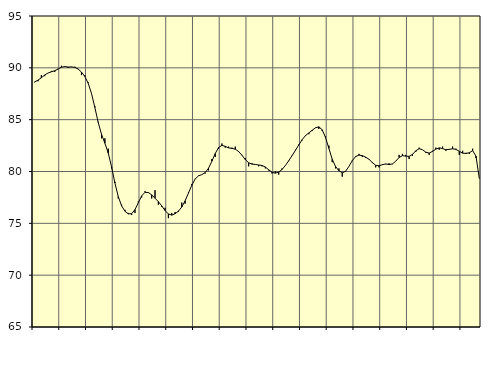
| Category | Piggar | Series 1 |
|---|---|---|
| nan | 88.6 | 88.65 |
| 87.0 | 88.7 | 88.81 |
| 87.0 | 89.3 | 89.04 |
| 87.0 | 89.2 | 89.31 |
| nan | 89.5 | 89.5 |
| 88.0 | 89.7 | 89.62 |
| 88.0 | 89.6 | 89.72 |
| 88.0 | 89.9 | 89.88 |
| nan | 90.2 | 90.06 |
| 89.0 | 90.1 | 90.12 |
| 89.0 | 90 | 90.08 |
| 89.0 | 90.1 | 90.08 |
| nan | 90.1 | 90.05 |
| 90.0 | 89.9 | 89.88 |
| 90.0 | 89.3 | 89.59 |
| 90.0 | 89.3 | 89.17 |
| nan | 88.6 | 88.52 |
| 91.0 | 87.5 | 87.53 |
| 91.0 | 86.3 | 86.18 |
| 91.0 | 84.8 | 84.74 |
| nan | 83.2 | 83.58 |
| 92.0 | 83.2 | 82.73 |
| 92.0 | 82.2 | 81.79 |
| 92.0 | 80.3 | 80.45 |
| nan | 79 | 78.89 |
| 93.0 | 77.4 | 77.58 |
| 93.0 | 76.8 | 76.69 |
| 93.0 | 76.3 | 76.17 |
| nan | 76 | 75.91 |
| 94.0 | 75.8 | 75.93 |
| 94.0 | 76 | 76.32 |
| 94.0 | 77.1 | 76.99 |
| nan | 77.5 | 77.65 |
| 95.0 | 78.1 | 77.99 |
| 95.0 | 78 | 77.97 |
| 95.0 | 77.4 | 77.75 |
| nan | 78.2 | 77.42 |
| 96.0 | 76.8 | 77.09 |
| 96.0 | 76.6 | 76.69 |
| 96.0 | 76.5 | 76.23 |
| nan | 75.5 | 75.91 |
| 97.0 | 76 | 75.79 |
| 97.0 | 76.1 | 75.92 |
| 97.0 | 76.1 | 76.18 |
| nan | 77 | 76.57 |
| 98.0 | 76.9 | 77.17 |
| 98.0 | 78 | 77.92 |
| 98.0 | 78.8 | 78.67 |
| nan | 79.3 | 79.28 |
| 99.0 | 79.6 | 79.58 |
| 99.0 | 79.7 | 79.7 |
| 99.0 | 79.8 | 79.89 |
| nan | 80.1 | 80.32 |
| 0.0 | 81.2 | 80.99 |
| 0.0 | 81.4 | 81.73 |
| 0.0 | 82.2 | 82.31 |
| nan | 82.7 | 82.52 |
| 1.0 | 82.3 | 82.43 |
| 1.0 | 82.4 | 82.28 |
| 1.0 | 82.3 | 82.23 |
| nan | 82.4 | 82.15 |
| 2.0 | 81.9 | 81.93 |
| 2.0 | 81.6 | 81.57 |
| 2.0 | 81.3 | 81.15 |
| nan | 80.5 | 80.84 |
| 3.0 | 80.8 | 80.71 |
| 3.0 | 80.7 | 80.68 |
| 3.0 | 80.5 | 80.63 |
| nan | 80.5 | 80.58 |
| 4.0 | 80.3 | 80.43 |
| 4.0 | 80.1 | 80.17 |
| 4.0 | 79.8 | 79.93 |
| nan | 80 | 79.84 |
| 5.0 | 79.7 | 79.95 |
| 5.0 | 80.3 | 80.2 |
| 5.0 | 80.6 | 80.58 |
| nan | 81 | 81.04 |
| 6.0 | 81.5 | 81.53 |
| 6.0 | 82.1 | 82.04 |
| 6.0 | 82.6 | 82.56 |
| nan | 83 | 83.07 |
| 7.0 | 83.5 | 83.46 |
| 7.0 | 83.6 | 83.72 |
| 7.0 | 83.9 | 83.98 |
| nan | 84.2 | 84.22 |
| 8.0 | 84.1 | 84.31 |
| 8.0 | 83.9 | 84.03 |
| 8.0 | 83.4 | 83.28 |
| nan | 82.5 | 82.23 |
| 9.0 | 80.9 | 81.18 |
| 9.0 | 80.3 | 80.48 |
| 9.0 | 80.3 | 80.07 |
| nan | 79.5 | 79.88 |
| 10.0 | 80 | 80.02 |
| 10.0 | 80.5 | 80.49 |
| 10.0 | 81 | 81.05 |
| nan | 81.5 | 81.44 |
| 11.0 | 81.7 | 81.58 |
| 11.0 | 81.4 | 81.53 |
| 11.0 | 81.3 | 81.38 |
| nan | 81.2 | 81.18 |
| 12.0 | 80.9 | 80.86 |
| 12.0 | 80.4 | 80.6 |
| 12.0 | 80.4 | 80.55 |
| nan | 80.7 | 80.66 |
| 13.0 | 80.7 | 80.73 |
| 13.0 | 80.8 | 80.67 |
| 13.0 | 80.7 | 80.73 |
| nan | 81 | 81 |
| 14.0 | 81.6 | 81.35 |
| 14.0 | 81.7 | 81.53 |
| 14.0 | 81.6 | 81.48 |
| nan | 81.2 | 81.46 |
| 15.0 | 81.5 | 81.65 |
| 15.0 | 81.9 | 82 |
| 15.0 | 82.3 | 82.2 |
| nan | 82.1 | 82.1 |
| 16.0 | 81.8 | 81.86 |
| 16.0 | 81.6 | 81.78 |
| 16.0 | 82 | 81.94 |
| nan | 82.3 | 82.16 |
| 17.0 | 82.1 | 82.28 |
| 17.0 | 82.4 | 82.21 |
| 17.0 | 82 | 82.1 |
| nan | 82.1 | 82.14 |
| 18.0 | 82.4 | 82.19 |
| 18.0 | 82.2 | 82.13 |
| 18.0 | 81.6 | 81.95 |
| nan | 82 | 81.77 |
| 19.0 | 81.8 | 81.74 |
| 19.0 | 81.7 | 81.81 |
| 19.0 | 82.2 | 82.01 |
| nan | 81.3 | 81.48 |
| 20.0 | 79.3 | 79.3 |